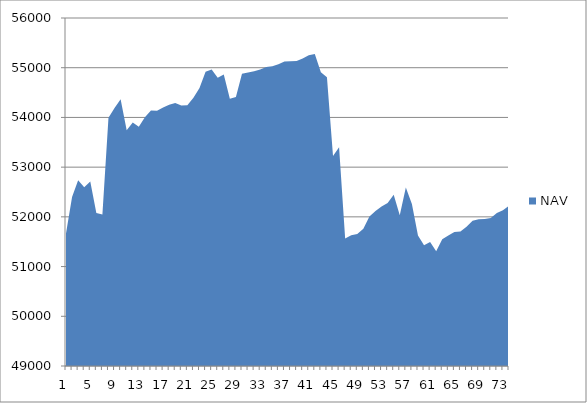
| Category | NAV |
|---|---|
| 0 | 51667 |
| 1 | 52397 |
| 2 | 52733.957 |
| 3 | 52597.875 |
| 4 | 52708.772 |
| 5 | 52075.184 |
| 6 | 52046.775 |
| 7 | 53991.219 |
| 8 | 54189.909 |
| 9 | 54364.909 |
| 10 | 53739.909 |
| 11 | 53899.542 |
| 12 | 53812.294 |
| 13 | 54003.961 |
| 14 | 54140.037 |
| 15 | 54132.37 |
| 16 | 54197.37 |
| 17 | 54255.812 |
| 18 | 54292.622 |
| 19 | 54240.699 |
| 20 | 54246.834 |
| 21 | 54397.391 |
| 22 | 54592.197 |
| 23 | 54920.119 |
| 24 | 54963.245 |
| 25 | 54796.799 |
| 26 | 54863.963 |
| 27 | 54375.975 |
| 28 | 54409.015 |
| 29 | 54878.402 |
| 30 | 54905.151 |
| 31 | 54927.958 |
| 32 | 54964.157 |
| 33 | 55012.385 |
| 34 | 55031.616 |
| 35 | 55070.791 |
| 36 | 55126.461 |
| 37 | 55131.71 |
| 38 | 55133.391 |
| 39 | 55184.783 |
| 40 | 55249.119 |
| 41 | 55278.196 |
| 42 | 54909.993 |
| 43 | 54807.052 |
| 44 | 53224.092 |
| 45 | 53401.214 |
| 46 | 51567.133 |
| 47 | 51627.536 |
| 48 | 51656.382 |
| 49 | 51762.295 |
| 50 | 52007.329 |
| 51 | 52120.149 |
| 52 | 52206.26 |
| 53 | 52279.944 |
| 54 | 52443.406 |
| 55 | 52034.315 |
| 56 | 52592.093 |
| 57 | 52259.795 |
| 58 | 51622.988 |
| 59 | 51427.586 |
| 60 | 51492.401 |
| 61 | 51307.336 |
| 62 | 51550.9 |
| 63 | 51625.058 |
| 64 | 51693.986 |
| 65 | 51704.014 |
| 66 | 51802.294 |
| 67 | 51922.294 |
| 68 | 51950.294 |
| 69 | 51956.603 |
| 70 | 51977.321 |
| 71 | 52075.871 |
| 72 | 52130.417 |
| 73 | 52221.221 |